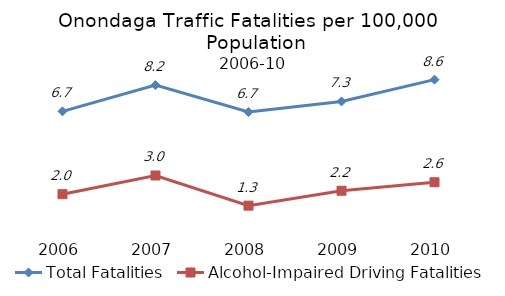
| Category | Total Fatalities | Alcohol-Impaired Driving Fatalities |
|---|---|---|
| 2006.0 | 6.73 | 1.95 |
| 2007.0 | 8.24 | 3.03 |
| 2008.0 | 6.69 | 1.29 |
| 2009.0 | 7.3 | 2.15 |
| 2010.0 | 8.56 | 2.64 |